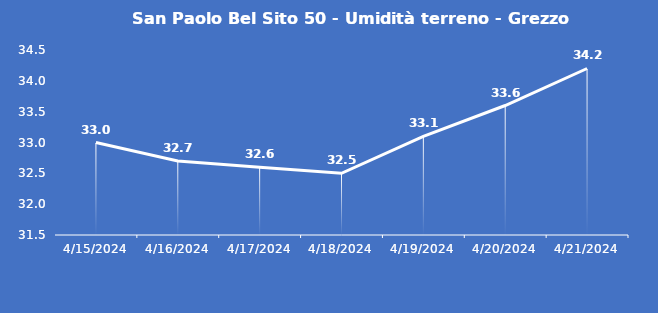
| Category | San Paolo Bel Sito 50 - Umidità terreno - Grezzo (%VWC) |
|---|---|
| 4/15/24 | 33 |
| 4/16/24 | 32.7 |
| 4/17/24 | 32.6 |
| 4/18/24 | 32.5 |
| 4/19/24 | 33.1 |
| 4/20/24 | 33.6 |
| 4/21/24 | 34.2 |